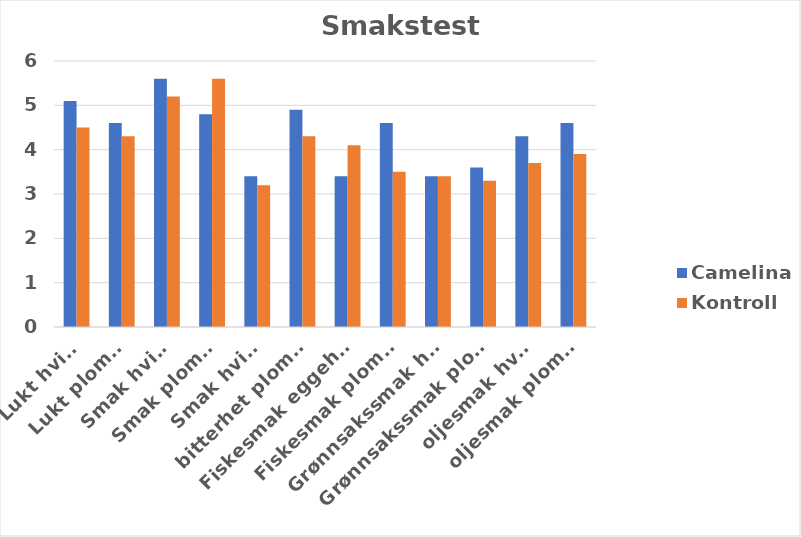
| Category | Camelina | Kontroll |
|---|---|---|
| Lukt hvite | 5.1 | 4.5 |
| Lukt plomme | 4.6 | 4.3 |
| Smak hvite | 5.6 | 5.2 |
| Smak plomme | 4.8 | 5.6 |
| Smak hvite | 3.4 | 3.2 |
| bitterhet plomme | 4.9 | 4.3 |
| Fiskesmak eggehvite | 3.4 | 4.1 |
| Fiskesmak plomme | 4.6 | 3.5 |
| Grønnsakssmak hvite | 3.4 | 3.4 |
| Grønnsakssmak plomme | 3.6 | 3.3 |
| oljesmak hvite | 4.3 | 3.7 |
| oljesmak plomme | 4.6 | 3.9 |